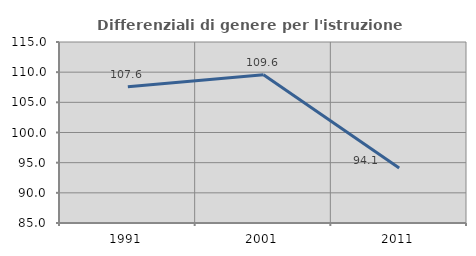
| Category | Differenziali di genere per l'istruzione superiore |
|---|---|
| 1991.0 | 107.596 |
| 2001.0 | 109.574 |
| 2011.0 | 94.132 |